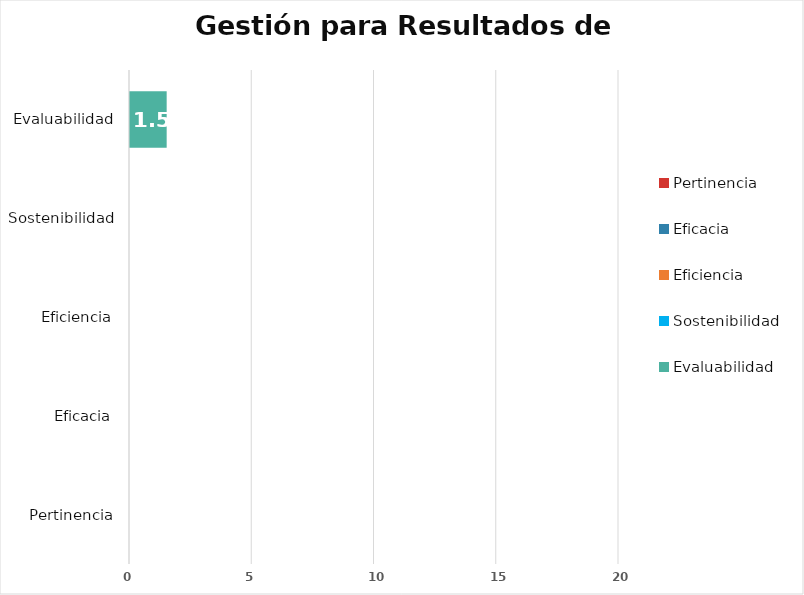
| Category | Series 2 |
|---|---|
| Pertinencia | 0 |
| Eficacia | 0 |
| Eficiencia | 0 |
| Sostenibilidad | 0 |
| Evaluabilidad | 1.5 |